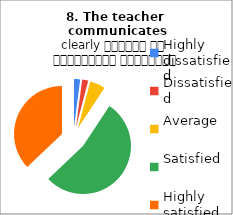
| Category | 8. The teacher 
communicates clearly शिक्षक का सम्प्रेषण सुस्पष्ट है |
|---|---|
| Highly dissatisfied | 2 |
| Dissatisfied | 2 |
| Average | 5 |
| Satisfied | 52 |
| Highly satisfied | 36 |